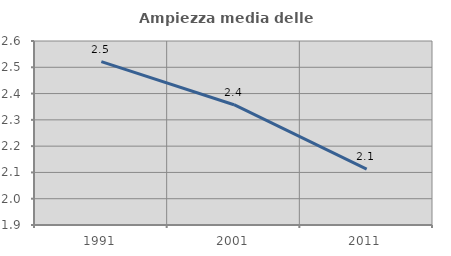
| Category | Ampiezza media delle famiglie |
|---|---|
| 1991.0 | 2.522 |
| 2001.0 | 2.358 |
| 2011.0 | 2.113 |